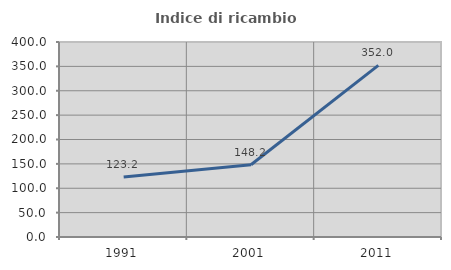
| Category | Indice di ricambio occupazionale  |
|---|---|
| 1991.0 | 123.221 |
| 2001.0 | 148.193 |
| 2011.0 | 352.047 |